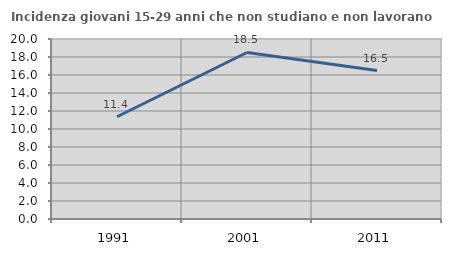
| Category | Incidenza giovani 15-29 anni che non studiano e non lavorano  |
|---|---|
| 1991.0 | 11.36 |
| 2001.0 | 18.502 |
| 2011.0 | 16.5 |